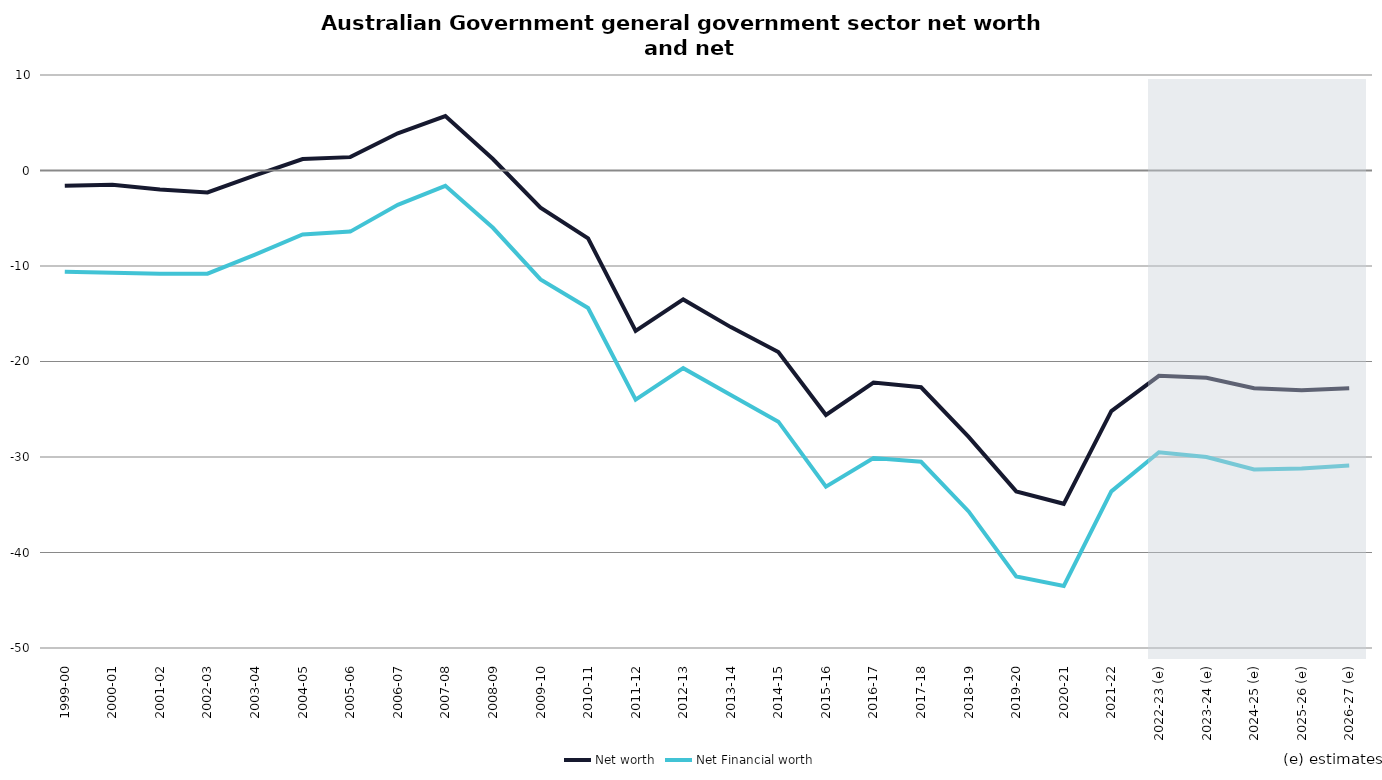
| Category | Net worth | Net Financial worth |
|---|---|---|
| 1999-00 | -1.6 | -10.6 |
| 2000-01 | -1.5 | -10.7 |
| 2001-02 | -2 | -10.8 |
| 2002-03 | -2.3 | -10.8 |
| 2003-04 | -0.5 | -8.8 |
| 2004-05 | 1.2 | -6.7 |
| 2005-06 | 1.4 | -6.4 |
| 2006-07 | 3.9 | -3.6 |
| 2007-08 | 5.7 | -1.6 |
| 2008-09 | 1.2 | -6 |
| 2009-10 | -3.9 | -11.4 |
| 2010-11 | -7.1 | -14.4 |
| 2011-12 | -16.8 | -24 |
| 2012-13 | -13.5 | -20.7 |
| 2013-14 | -16.4 | -23.5 |
| 2014-15 | -19 | -26.3 |
| 2015-16 | -25.6 | -33.1 |
| 2016-17 | -22.2 | -30.1 |
| 2017-18 | -22.7 | -30.5 |
| 2018-19 | -27.9 | -35.7 |
| 2019-20 | -33.6 | -42.5 |
| 2020-21 | -34.9 | -43.5 |
| 2021-22 | -25.2 | -33.6 |
| 2022-23 (e) | -21.5 | -29.5 |
| 2023-24 (e) | -21.7 | -30 |
| 2024-25 (e) | -22.8 | -31.3 |
| 2025-26 (e) | -23 | -31.2 |
| 2026-27 (e) | -22.8 | -30.9 |